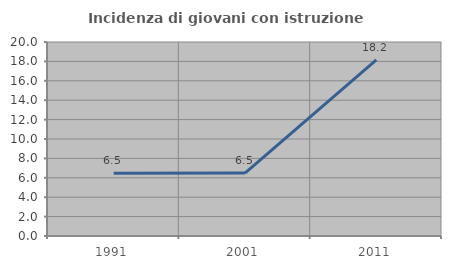
| Category | Incidenza di giovani con istruzione universitaria |
|---|---|
| 1991.0 | 6.463 |
| 2001.0 | 6.491 |
| 2011.0 | 18.165 |